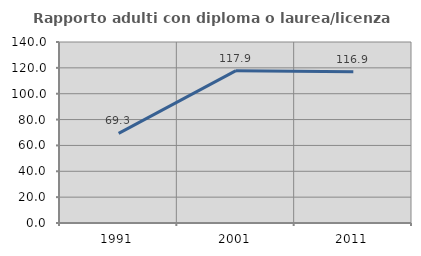
| Category | Rapporto adulti con diploma o laurea/licenza media  |
|---|---|
| 1991.0 | 69.333 |
| 2001.0 | 117.857 |
| 2011.0 | 116.949 |